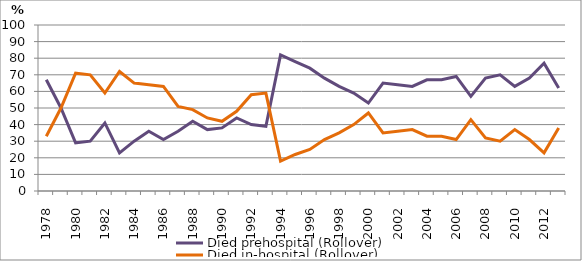
| Category | Died prehospital (Rollover) | Died in-hospital (Rollover) |
|---|---|---|
| 1978.0 | 67 | 33 |
| 1979.0 | 50 | 50 |
| 1980.0 | 29 | 71 |
| 1981.0 | 30 | 70 |
| 1982.0 | 41 | 59 |
| 1983.0 | 23 | 72 |
| 1984.0 | 30 | 65 |
| 1985.0 | 36 | 64 |
| 1986.0 | 31 | 63 |
| 1987.0 | 36 | 51 |
| 1988.0 | 42 | 49 |
| 1989.0 | 37 | 44 |
| 1990.0 | 38 | 42 |
| 1991.0 | 44 | 48 |
| 1992.0 | 40 | 58 |
| 1993.0 | 39 | 59 |
| 1994.0 | 82 | 18 |
| 1995.0 | 78 | 22 |
| 1996.0 | 74 | 25 |
| 1997.0 | 68 | 31 |
| 1998.0 | 63 | 35 |
| 1999.0 | 59 | 40 |
| 2000.0 | 53 | 47 |
| 2001.0 | 65 | 35 |
| 2002.0 | 64 | 36 |
| 2003.0 | 63 | 37 |
| 2004.0 | 67 | 33 |
| 2005.0 | 67 | 33 |
| 2006.0 | 69 | 31 |
| 2007.0 | 57 | 43 |
| 2008.0 | 68 | 32 |
| 2009.0 | 70 | 30 |
| 2010.0 | 63 | 37 |
| 2011.0 | 68 | 31 |
| 2012.0 | 77 | 23 |
| 2013.0 | 62 | 38 |